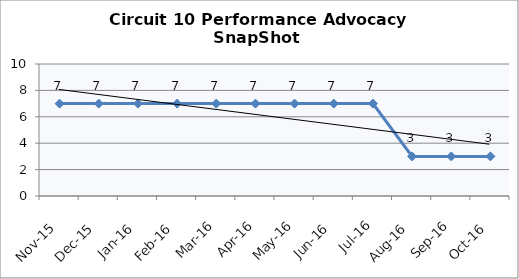
| Category | Circuit 10 |
|---|---|
| Nov-15 | 7 |
| Dec-15 | 7 |
| Jan-16 | 7 |
| Feb-16 | 7 |
| Mar-16 | 7 |
| Apr-16 | 7 |
| May-16 | 7 |
| Jun-16 | 7 |
| Jul-16 | 7 |
| Aug-16 | 3 |
| Sep-16 | 3 |
| Oct-16 | 3 |